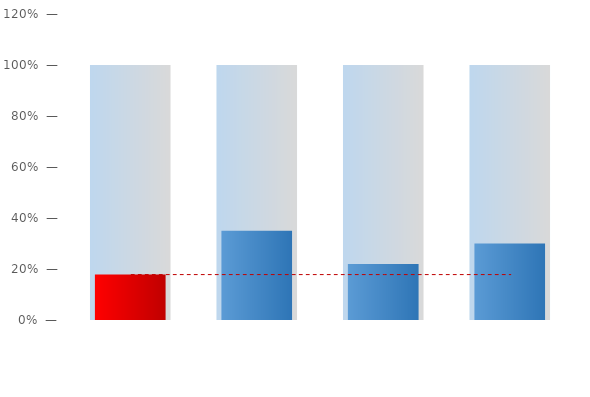
| Category | норма |
|---|---|
| времени
прошло
18% | 1 |
| годовая
выручка
35% | 1 |
| прямые
расходы
22% | 1 |
| марж
доход
30% | 1 |